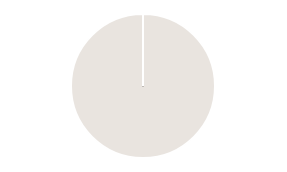
| Category | Series 0 |
|---|---|
| 0 | 126 |
| 1 | 0 |